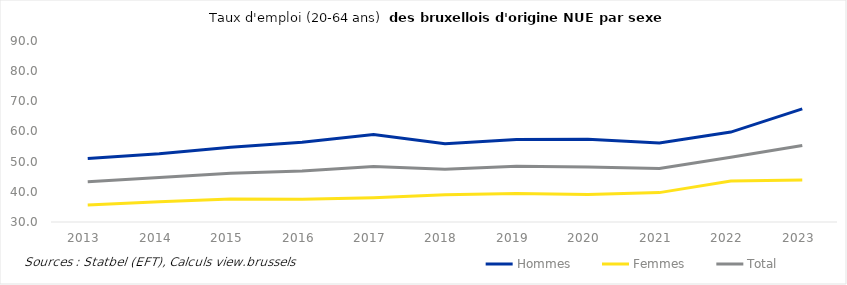
| Category | Hommes | Femmes | Total |
|---|---|---|---|
| 2013.0 | 51.026 | 35.624 | 43.365 |
| 2014.0 | 52.623 | 36.688 | 44.724 |
| 2015.0 | 54.768 | 37.594 | 46.169 |
| 2016.0 | 56.409 | 37.505 | 46.943 |
| 2017.0 | 58.987 | 38.029 | 48.384 |
| 2018.0 | 55.973 | 39.023 | 47.469 |
| 2019.0 | 57.372 | 39.487 | 48.447 |
| 2020.0 | 57.458 | 39.116 | 48.265 |
| 2021.0 | 56.223 | 39.739 | 47.734 |
| 2022.0 | 59.81 | 43.559 | 51.495 |
| 2023.0 | 67.521 | 43.915 | 55.374 |